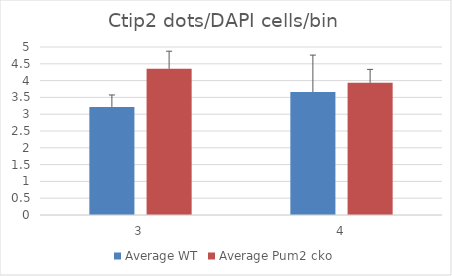
| Category | Average WT | Average Pum2 cko |
|---|---|---|
| 3.0 | 3.216 | 4.351 |
| 4.0 | 3.659 | 3.933 |